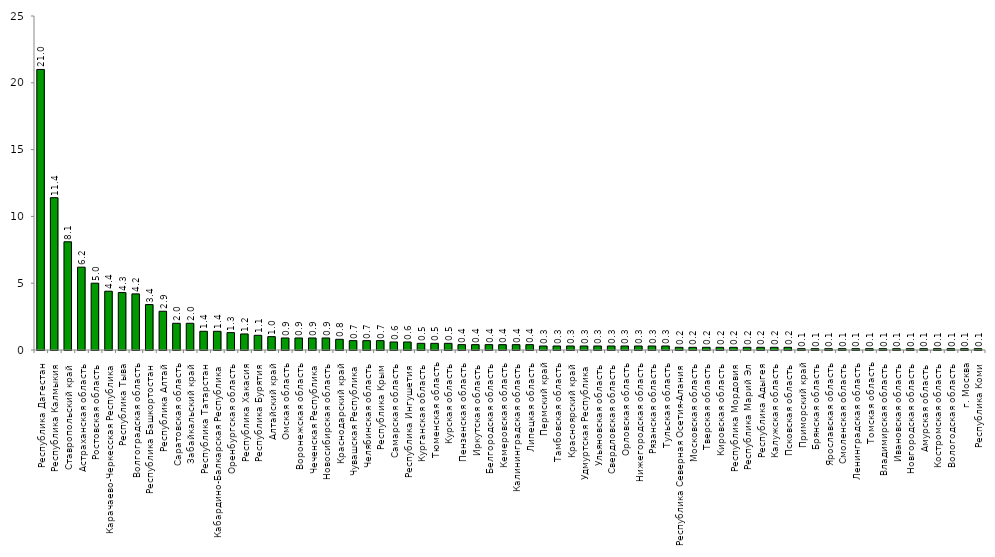
| Category | Series 0 |
|---|---|
| Республика Дагестан | 21 |
| Республика Калмыкия | 11.4 |
| Ставропольский край | 8.1 |
| Астраханская область | 6.2 |
| Ростовская область | 5 |
| Карачаево-Черкесская Республика | 4.4 |
| Республика Тыва | 4.3 |
| Волгоградская область | 4.2 |
| Республика Башкортостан | 3.4 |
| Республика Алтай | 2.9 |
| Саратовская область | 2 |
| Забайкальский край | 2 |
| Республика Татарстан | 1.4 |
| Кабардино-Балкарская Республика | 1.4 |
| Оренбургская область | 1.3 |
| Республика Хакасия | 1.2 |
| Республика Бурятия | 1.1 |
| Алтайский край | 1 |
| Омская область | 0.9 |
| Воронежская область | 0.9 |
| Чеченская Республика | 0.9 |
| Новосибирская область | 0.9 |
| Краснодарский край | 0.8 |
| Чувашская Республика | 0.7 |
| Челябинская область | 0.7 |
| Республика Крым | 0.7 |
| Самарская область | 0.6 |
| Республика Ингушетия | 0.6 |
| Курганская область | 0.5 |
| Тюменская область | 0.5 |
| Курская область | 0.5 |
| Пензенская область | 0.4 |
| Иркутская область | 0.4 |
| Белгородская область | 0.4 |
| Кемеровская область | 0.4 |
| Калининградская область | 0.4 |
| Липецкая область | 0.4 |
| Пермский край | 0.3 |
| Тамбовская область | 0.3 |
| Красноярский край | 0.3 |
| Удмуртская Республика | 0.3 |
| Ульяновская область | 0.3 |
| Свердловская область | 0.3 |
| Орловская область | 0.3 |
| Нижегородская область | 0.3 |
| Рязанская область | 0.3 |
| Тульская область | 0.3 |
| Республика Северная Осетия-Алания | 0.2 |
| Московская область | 0.2 |
| Тверская область | 0.2 |
| Кировская область | 0.2 |
| Республика Мордовия | 0.2 |
| Республика Марий Эл | 0.2 |
| Республика Адыгея | 0.2 |
| Калужская область | 0.2 |
| Псковская область | 0.2 |
| Приморский край | 0.1 |
| Брянская область | 0.1 |
| Ярославская область | 0.1 |
| Смоленская область | 0.1 |
| Ленинградская область | 0.1 |
| Томская область | 0.1 |
| Владимирская область | 0.1 |
| Ивановская область | 0.1 |
| Новгородская область | 0.1 |
| Амурская область | 0.1 |
| Костромская область | 0.1 |
| Вологодская область | 0.1 |
| г. Москва | 0.1 |
| Республика Коми | 0.1 |